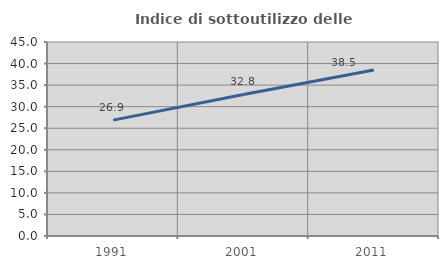
| Category | Indice di sottoutilizzo delle abitazioni  |
|---|---|
| 1991.0 | 26.883 |
| 2001.0 | 32.843 |
| 2011.0 | 38.512 |